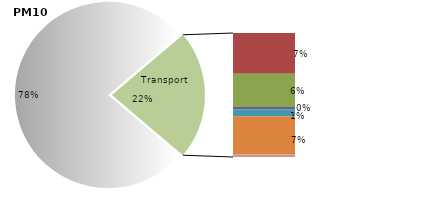
| Category | Series 0 |
|---|---|
| Non-transport sectors | 1709.891 |
| Road transport exhaust | 161.731 |
| Road transport non-exhaust | 132.463 |
| Railways | 9.03 |
| Domestic shipping | 27.649 |
| International shipping | 151.762 |
| Domestic aviation | 1.286 |
| International aviation | 8.937 |